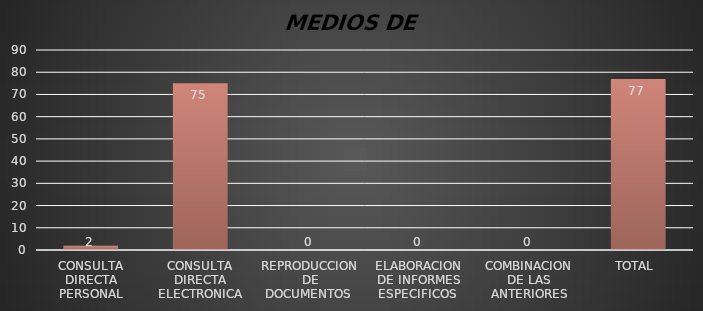
| Category | Series 1 |
|---|---|
| CONSULTA DIRECTA PERSONAL | 2 |
| CONSULTA DIRECTA ELECTRONICA | 75 |
| REPRODUCCION DE DOCUMENTOS  | 0 |
| ELABORACION DE INFORMES ESPECIFICOS  | 0 |
| COMBINACION DE LAS ANTERIORES | 0 |
| TOTAL  | 77 |